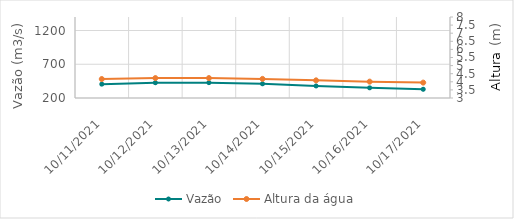
| Category | Vazão |
|---|---|
| 8/1/21 | 1247.64 |
| 7/31/21 | 1293.79 |
| 7/30/21 | 1286.56 |
| 7/29/21 | 1253.28 |
| 7/28/21 | 1187.11 |
| 7/27/21 | 1216.65 |
| 7/26/21 | 1225.57 |